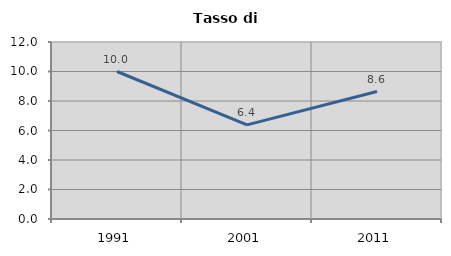
| Category | Tasso di disoccupazione   |
|---|---|
| 1991.0 | 10 |
| 2001.0 | 6.379 |
| 2011.0 | 8.64 |